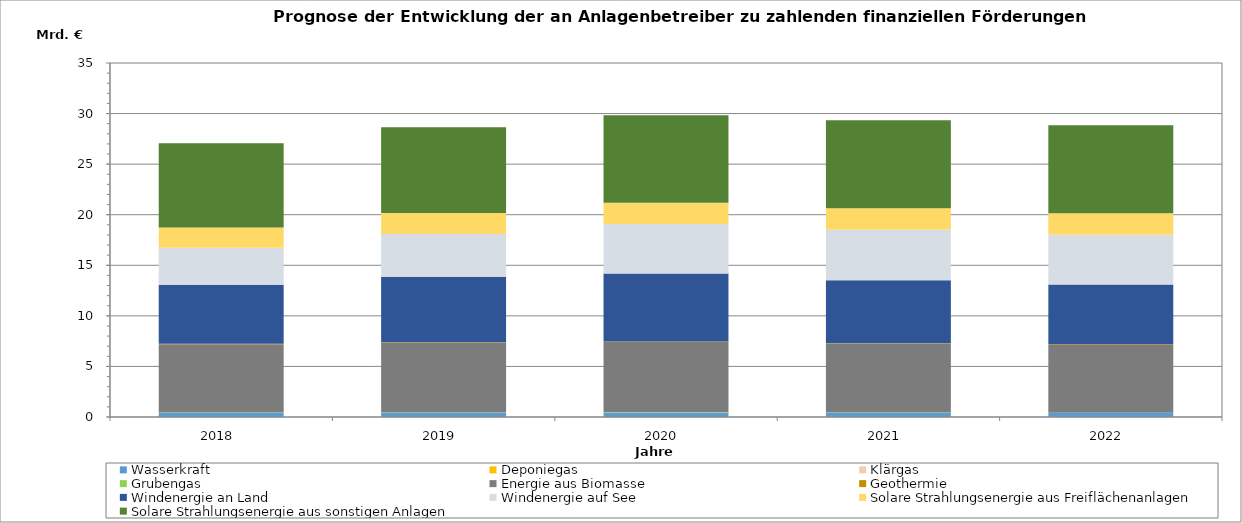
| Category | Wasserkraft | Deponiegas | Klärgas | Grubengas | Energie aus Biomasse | Geothermie | Windenergie an Land | Windenergie auf See | Solare Strahlungsenergie aus Freiflächenanlagen | Solare Strahlungsenergie aus sonstigen Anlagen |
|---|---|---|---|---|---|---|---|---|---|---|
| 2018.0 | 389.191 | 13.182 | 3.18 | 41.75 | 6750.998 | 43.103 | 5845.72 | 3642.555 | 2013.671 | 8329.419 |
| 2019.0 | 398.003 | 12.306 | 3.26 | 43.03 | 6885.668 | 54.96 | 6465.945 | 4229.863 | 2076.602 | 8474.912 |
| 2020.0 | 400.514 | 11.249 | 3.297 | 42.51 | 6958.989 | 58.812 | 6718.59 | 4877.877 | 2122.214 | 8637.693 |
| 2021.0 | 396.952 | 4.691 | 2.025 | 34.173 | 6794.293 | 63.438 | 6220.913 | 4995.677 | 2120.737 | 8703.679 |
| 2022.0 | 395.393 | 3.131 | 1.806 | 27.559 | 6692.355 | 63.532 | 5915.382 | 4924.691 | 2117.011 | 8703.855 |